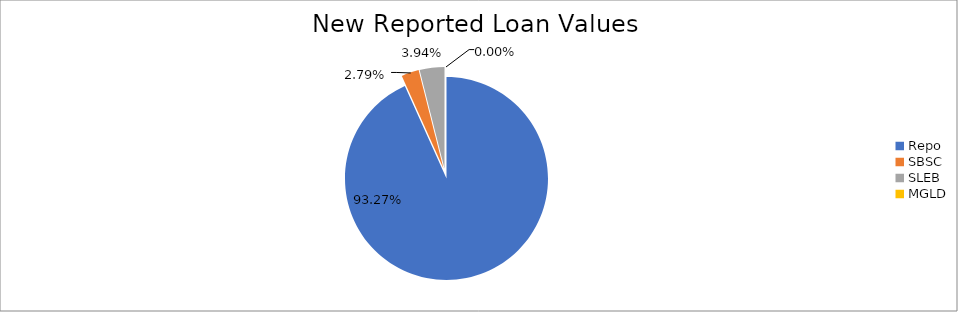
| Category | Series 0 |
|---|---|
| Repo | 10178214.022 |
| SBSC | 304506.503 |
| SLEB | 430207.855 |
| MGLD | 171.76 |